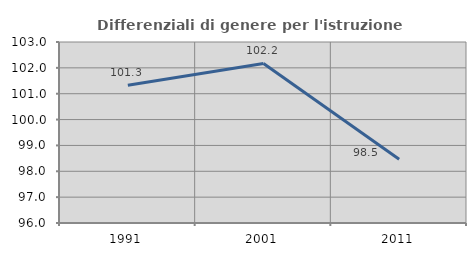
| Category | Differenziali di genere per l'istruzione superiore |
|---|---|
| 1991.0 | 101.331 |
| 2001.0 | 102.169 |
| 2011.0 | 98.466 |